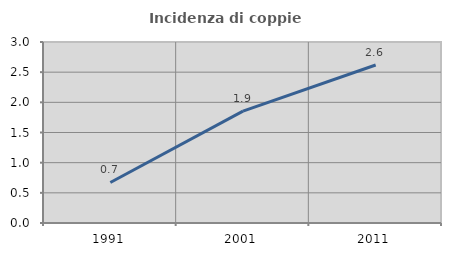
| Category | Incidenza di coppie miste |
|---|---|
| 1991.0 | 0.672 |
| 2001.0 | 1.854 |
| 2011.0 | 2.619 |